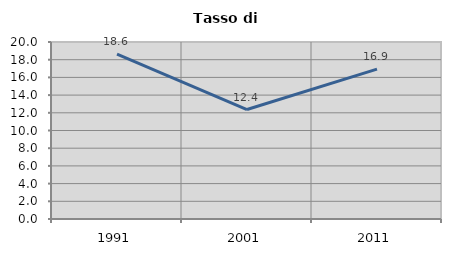
| Category | Tasso di disoccupazione   |
|---|---|
| 1991.0 | 18.621 |
| 2001.0 | 12.371 |
| 2011.0 | 16.935 |